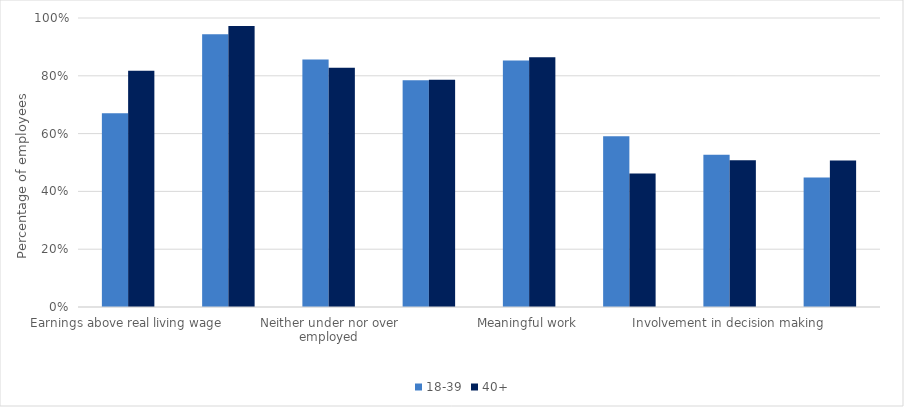
| Category | 18-39 | 40+ |
|---|---|---|
| Earnings above real living wage | 0.671 | 0.817 |
| Secure employment | 0.943 | 0.973 |
| Neither under nor over employed | 0.856 | 0.828 |
| Job satisfaction | 0.785 | 0.787 |
| Meaningful work | 0.853 | 0.864 |
| Career progression | 0.591 | 0.462 |
| Involvement in decision making | 0.527 | 0.508 |
| Flexible working | 0.448 | 0.507 |